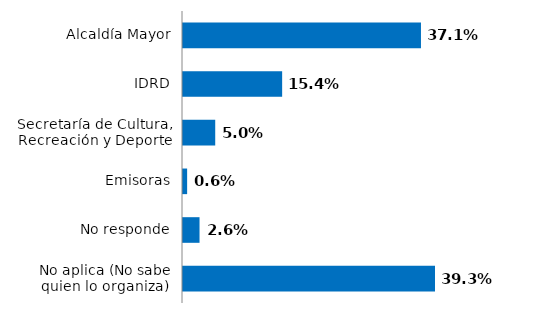
| Category | Series 0 |
|---|---|
| Alcaldía Mayor | 0.371 |
| IDRD | 0.154 |
| Secretaría de Cultura, Recreación y Deporte | 0.05 |
| Emisoras | 0.006 |
| No responde | 0.026 |
| No aplica (No sabe quien lo organiza) | 0.393 |